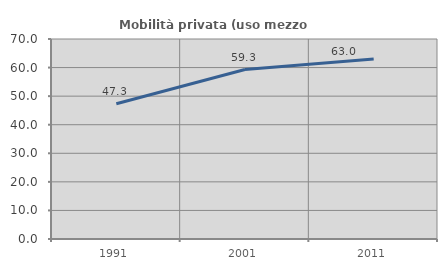
| Category | Mobilità privata (uso mezzo privato) |
|---|---|
| 1991.0 | 47.348 |
| 2001.0 | 59.319 |
| 2011.0 | 63.017 |